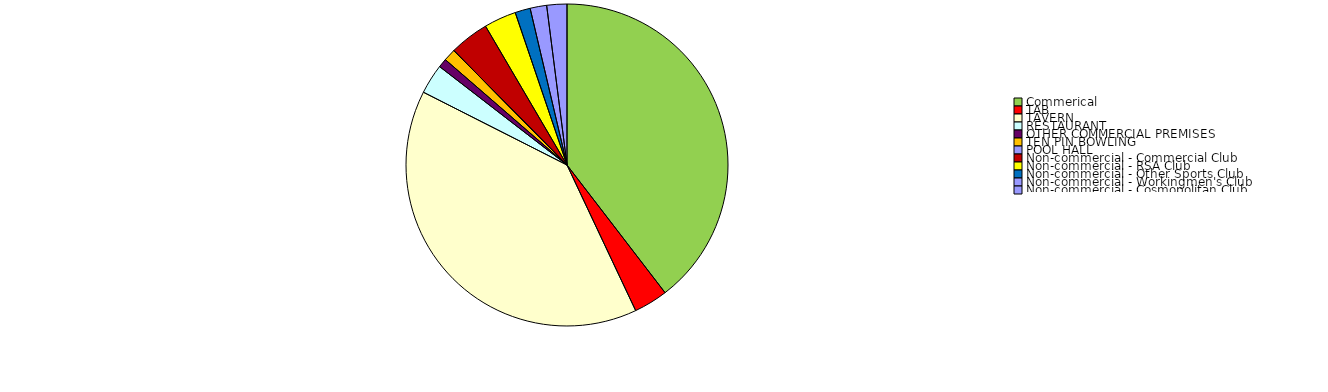
| Category | Series 0 |
|---|---|
| Commerical | 82754453.52 |
| TAB | 7133336.96 |
| TAVERN | 82555359.54 |
| RESTAURANT | 6272896.53 |
| OTHER COMMERCIAL PREMISES | 1866627.37 |
| TEN PIN BOWLING | 2576421.32 |
| POOL HALL | 0 |
| Non-commercial - Commercial Club | 8284710.22 |
| Non-commercial - RSA Club | 6764375.88 |
| Non-commercial - Other Sports Club | 3202713.32 |
| Non-commercial - Workingmen's Club | 3468729.1 |
| Non-commercial - Cosmopolitan Club | 4231375.33 |